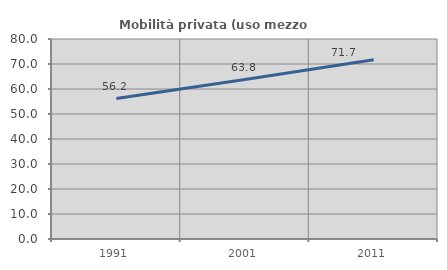
| Category | Mobilità privata (uso mezzo privato) |
|---|---|
| 1991.0 | 56.192 |
| 2001.0 | 63.775 |
| 2011.0 | 71.742 |